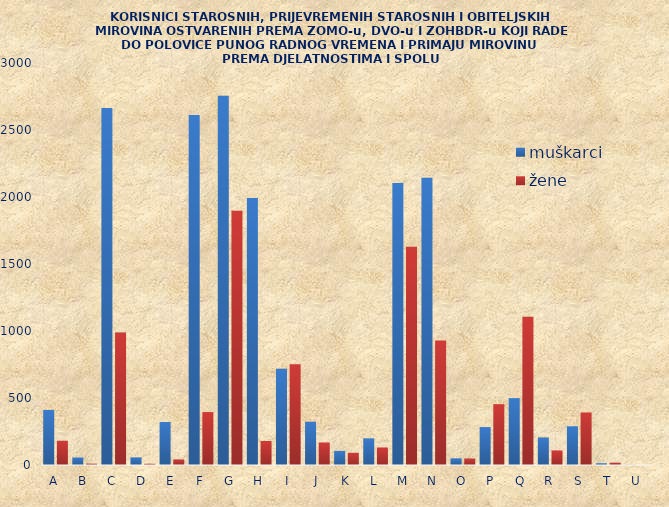
| Category | muškarci | žene |
|---|---|---|
| A | 411 | 181 |
| B | 56 | 10 |
| C | 2665 | 988 |
| D | 57 | 9 |
| E | 321 | 41 |
| F | 2612 | 395 |
| G | 2755 | 1897 |
| H | 1993 | 179 |
| I | 718 | 751 |
| J | 323 | 168 |
| K | 105 | 91 |
| L | 199 | 131 |
| M | 2104 | 1628 |
| N | 2143 | 930 |
| O | 50 | 48 |
| P | 283 | 454 |
| Q | 499 | 1106 |
| R | 205 | 109 |
| S | 289 | 392 |
| T | 13 | 17 |
| U | 1 | 0 |